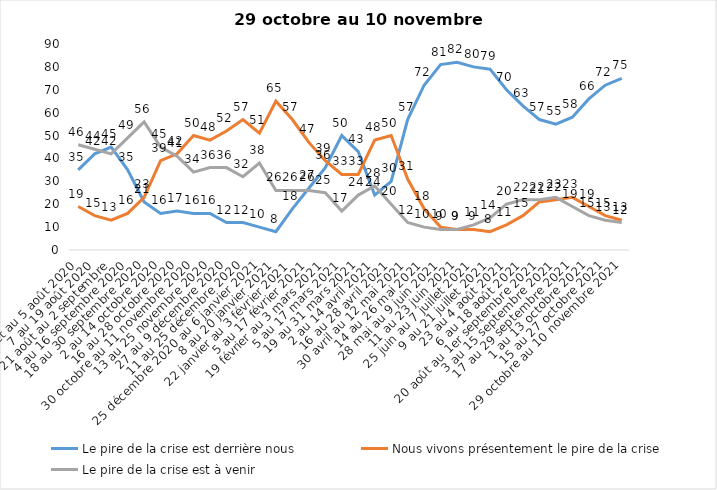
| Category | Le pire de la crise est derrière nous | Nous vivons présentement le pire de la crise | Le pire de la crise est à venir |
|---|---|---|---|
| 24 juillet au 5 août 2020 | 35 | 19 | 46 |
| 7 au 19 août 2020 | 42 | 15 | 44 |
| 21 août au 2 septembre | 45 | 13 | 42 |
| 4 au 16 septembre 2020 | 35 | 16 | 49 |
| 18 au 30 septembre 2020 | 21 | 23 | 56 |
| 2 au 14 octobre 2020 | 16 | 39 | 45 |
| 16 au 28 octobre 2020 | 17 | 42 | 41 |
| 30 octobre au 11 novembre 2020 | 16 | 50 | 34 |
| 13 au 25 novembre 2020 | 16 | 48 | 36 |
| 27 au 9 décembre 2020 | 12 | 52 | 36 |
| 11 au 25 décembre 2020 | 12 | 57 | 32 |
| 25 décembre 2020 au 6 janvier 2021 | 10 | 51 | 38 |
| 8 au 20 janvier 2021 | 8 | 65 | 26 |
| 22 janvier au 3 février 2021 | 18 | 57 | 26 |
| 5 au 17 février 2021 | 27 | 47 | 26 |
| 19 février au 3 mars 2021 | 36 | 39 | 25 |
| 5 au 17 mars 2021 | 50 | 33 | 17 |
| 19 au 31 mars 2021 | 43 | 33 | 24 |
| 2 au 14 avril 2021 | 24 | 48 | 28 |
| 16 au 28 avril 2021 | 30 | 50 | 20 |
| 30 avril au 12 mai 2021 | 57 | 31 | 12 |
| 14 au 26 mai 2021 | 72 | 18 | 10 |
| 28 mai au 9 juin 2021 | 81 | 10 | 9 |
| 11 au 23 juin 2021 | 82 | 9 | 9 |
| 25 juin au 7 juillet 2021 | 80 | 9 | 11 |
| 9 au 21 juillet 2021 | 79 | 8 | 14 |
| 23 au 4 août 2021 | 70 | 11 | 20 |
| 6 au 18 août 2021 | 63 | 15 | 22 |
| 20 août au 1er septembre 2021 | 57 | 21 | 22 |
| 3 au 15 septembre 2021 | 55 | 22 | 23 |
| 17 au 29 septembre 2021 | 58 | 23 | 19 |
| 1 au 13 octobre 2021 | 66 | 19 | 15 |
| 15 au 27 octobre 2021 | 72 | 15 | 13 |
| 29 octobre au 10 novembre 2021 | 75 | 13 | 12 |